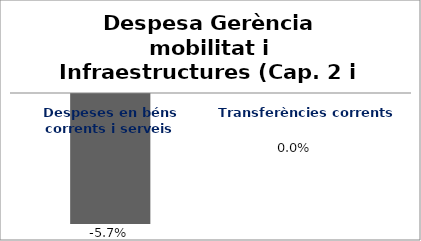
| Category | Series 0 |
|---|---|
| Despeses en béns corrents i serveis | -0.057 |
| Transferències corrents | 0 |